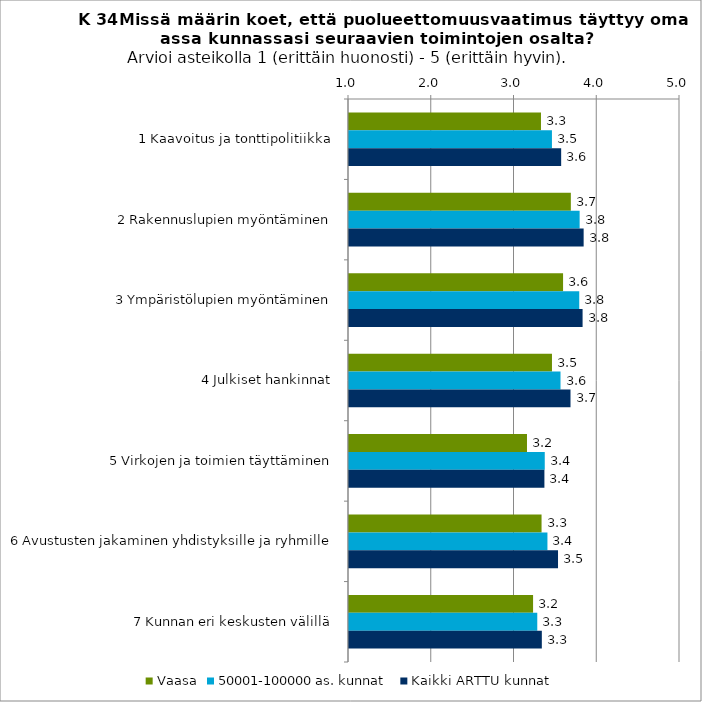
| Category | Vaasa | 50001-100000 as. kunnat | Kaikki ARTTU kunnat |
|---|---|---|---|
| 1 Kaavoitus ja tonttipolitiikka | 3.32 | 3.452 | 3.564 |
| 2 Rakennuslupien myöntäminen | 3.681 | 3.787 | 3.836 |
| 3 Ympäristölupien myöntäminen | 3.587 | 3.782 | 3.823 |
| 4 Julkiset hankinnat | 3.453 | 3.556 | 3.677 |
| 5 Virkojen ja toimien täyttäminen | 3.151 | 3.366 | 3.361 |
| 6 Avustusten jakaminen yhdistyksille ja ryhmille | 3.327 | 3.398 | 3.526 |
| 7 Kunnan eri keskusten välillä | 3.224 | 3.275 | 3.33 |